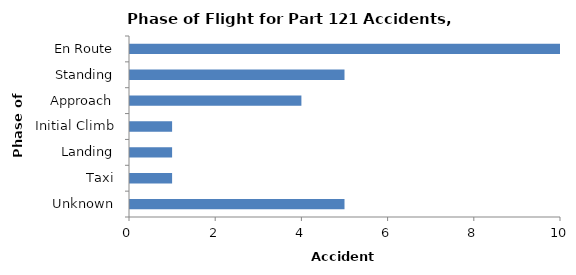
| Category | Accident Aircraft |
|---|---|
| En Route | 10 |
| Standing | 5 |
| Approach | 4 |
| Initial Climb | 1 |
| Landing | 1 |
| Taxi | 1 |
| Unknown | 5 |